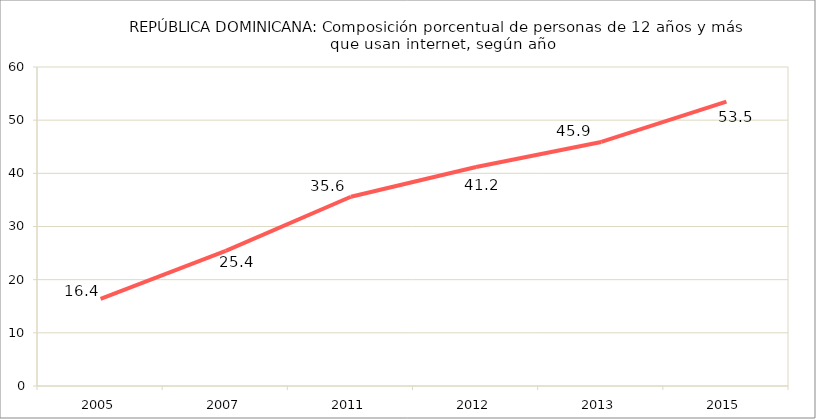
| Category |  Porcentaje de 
personas  |
|---|---|
| 2005.0 | 16.4 |
| 2007.0 | 25.4 |
| 2011.0 | 35.6 |
| 2012.0 | 41.2 |
| 2013.0 | 45.9 |
| 2015.0 | 53.5 |